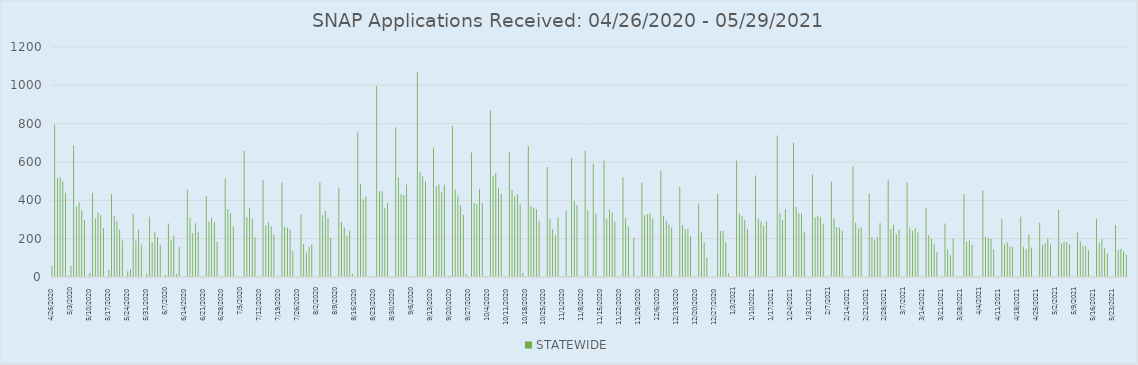
| Category | STATEWIDE |
|---|---|
| 4/26/20 | 59 |
| 4/27/20 | 794 |
| 4/28/20 | 515 |
| 4/29/20 | 519 |
| 4/30/20 | 500 |
| 5/1/20 | 440 |
| 5/2/20 | 8 |
| 5/3/20 | 57 |
| 5/4/20 | 686 |
| 5/5/20 | 366 |
| 5/6/20 | 389 |
| 5/7/20 | 348 |
| 5/8/20 | 298 |
| 5/10/20 | 21 |
| 5/11/20 | 440 |
| 5/12/20 | 306 |
| 5/13/20 | 338 |
| 5/14/20 | 323 |
| 5/15/20 | 256 |
| 5/17/20 | 36 |
| 5/18/20 | 432 |
| 5/19/20 | 320 |
| 5/20/20 | 291 |
| 5/21/20 | 247 |
| 5/22/20 | 191 |
| 5/24/20 | 30 |
| 5/25/20 | 42 |
| 5/26/20 | 331 |
| 5/27/20 | 191 |
| 5/28/20 | 248 |
| 5/29/20 | 169 |
| 5/31/20 | 17 |
| 6/1/20 | 314 |
| 6/2/20 | 182 |
| 6/3/20 | 236 |
| 6/4/20 | 209 |
| 6/5/20 | 168 |
| 6/7/20 | 12 |
| 6/8/20 | 279 |
| 6/9/20 | 193 |
| 6/10/20 | 215 |
| 6/11/20 | 16 |
| 6/12/20 | 157 |
| 6/14/20 | 4 |
| 6/15/20 | 455 |
| 6/16/20 | 309 |
| 6/17/20 | 228 |
| 6/18/20 | 280 |
| 6/19/20 | 236 |
| 6/21/20 | 2 |
| 6/22/20 | 423 |
| 6/23/20 | 288 |
| 6/24/20 | 311 |
| 6/25/20 | 287 |
| 6/26/20 | 182 |
| 6/28/20 | 1 |
| 6/29/20 | 512 |
| 6/30/20 | 354 |
| 7/1/20 | 332 |
| 7/2/20 | 263 |
| 7/6/20 | 657 |
| 7/7/20 | 313 |
| 7/8/20 | 359 |
| 7/9/20 | 302 |
| 7/10/20 | 207 |
| 7/12/20 | 1 |
| 7/13/20 | 508 |
| 7/14/20 | 270 |
| 7/15/20 | 286 |
| 7/16/20 | 264 |
| 7/17/20 | 225 |
| 7/20/20 | 495 |
| 7/21/20 | 262 |
| 7/22/20 | 257 |
| 7/23/20 | 247 |
| 7/24/20 | 136 |
| 7/27/20 | 327 |
| 7/28/20 | 172 |
| 7/29/20 | 128 |
| 7/30/20 | 158 |
| 7/31/20 | 171 |
| 8/2/20 | 1 |
| 8/3/20 | 495 |
| 8/4/20 | 322 |
| 8/5/20 | 346 |
| 8/6/20 | 309 |
| 8/7/20 | 203 |
| 8/9/20 | 1 |
| 8/10/20 | 466 |
| 8/11/20 | 287 |
| 8/12/20 | 258 |
| 8/13/20 | 216 |
| 8/14/20 | 241 |
| 8/15/20 | 17 |
| 8/16/20 | 2 |
| 8/17/20 | 759 |
| 8/18/20 | 484 |
| 8/19/20 | 405 |
| 8/20/20 | 421 |
| 8/21/20 | 3 |
| 8/22/20 | 1 |
| 8/23/20 | 1 |
| 8/24/20 | 996 |
| 8/25/20 | 448 |
| 8/26/20 | 448 |
| 8/27/20 | 361 |
| 8/28/20 | 386 |
| 8/29/20 | 2 |
| 8/30/20 | 4 |
| 8/31/20 | 781 |
| 9/1/20 | 519 |
| 9/2/20 | 433 |
| 9/3/20 | 428 |
| 9/4/20 | 483 |
| 9/5/20 | 3 |
| 9/6/20 | 1 |
| 9/7/20 | 4 |
| 9/8/20 | 1069 |
| 9/9/20 | 549 |
| 9/10/20 | 525 |
| 9/11/20 | 500 |
| 9/12/20 | 1 |
| 9/14/20 | 676 |
| 9/15/20 | 473 |
| 9/16/20 | 482 |
| 9/17/20 | 442 |
| 9/18/20 | 481 |
| 9/19/20 | 2 |
| 9/20/20 | 8 |
| 9/21/20 | 787 |
| 9/22/20 | 457 |
| 9/23/20 | 425 |
| 9/24/20 | 373 |
| 9/25/20 | 324 |
| 9/26/20 | 16 |
| 9/27/20 | 2 |
| 9/28/20 | 650 |
| 9/29/20 | 386 |
| 9/30/20 | 379 |
| 10/1/20 | 460 |
| 10/2/20 | 385 |
| 10/3/20 | 2 |
| 10/4/20 | 1 |
| 10/5/20 | 870 |
| 10/6/20 | 527 |
| 10/7/20 | 543 |
| 10/8/20 | 463 |
| 10/9/20 | 435 |
| 10/10/20 | 1 |
| 10/12/20 | 651 |
| 10/13/20 | 455 |
| 10/14/20 | 423 |
| 10/15/20 | 431 |
| 10/16/20 | 380 |
| 10/17/20 | 22 |
| 10/18/20 | 2 |
| 10/19/20 | 683 |
| 10/20/20 | 371 |
| 10/21/20 | 361 |
| 10/22/20 | 353 |
| 10/23/20 | 293 |
| 10/25/20 | 1 |
| 10/26/20 | 574 |
| 10/27/20 | 302 |
| 10/28/20 | 249 |
| 10/29/20 | 218 |
| 10/30/20 | 310 |
| 10/31/20 | 1 |
| 11/1/20 | 5 |
| 11/2/20 | 344 |
| 11/3/20 | 5 |
| 11/4/20 | 621 |
| 11/5/20 | 398 |
| 11/6/20 | 375 |
| 11/8/20 | 1 |
| 11/9/20 | 658 |
| 11/10/20 | 348 |
| 11/11/20 | 3 |
| 11/12/20 | 591 |
| 11/13/20 | 330 |
| 11/14/20 | 1 |
| 11/16/20 | 608 |
| 11/17/20 | 303 |
| 11/18/20 | 352 |
| 11/19/20 | 336 |
| 11/20/20 | 289 |
| 11/21/20 | 1 |
| 11/23/20 | 520 |
| 11/24/20 | 309 |
| 11/25/20 | 261 |
| 11/26/20 | 1 |
| 11/27/20 | 204 |
| 11/29/20 | 2 |
| 11/30/20 | 492 |
| 12/1/20 | 322 |
| 12/2/20 | 327 |
| 12/3/20 | 332 |
| 12/4/20 | 305 |
| 12/5/20 | 1 |
| 12/7/20 | 554 |
| 12/8/20 | 318 |
| 12/9/20 | 293 |
| 12/10/20 | 274 |
| 12/11/20 | 257 |
| 12/13/20 | 1 |
| 12/14/20 | 469 |
| 12/15/20 | 270 |
| 12/16/20 | 250 |
| 12/17/20 | 250 |
| 12/18/20 | 214 |
| 12/20/20 | 3 |
| 12/21/20 | 383 |
| 12/22/20 | 233 |
| 12/23/20 | 182 |
| 12/24/20 | 103 |
| 12/26/20 | 2 |
| 12/28/20 | 432 |
| 12/29/20 | 240 |
| 12/30/20 | 241 |
| 12/31/20 | 181 |
| 1/1/21 | 19 |
| 1/2/21 | 1 |
| 1/4/21 | 608 |
| 1/5/21 | 330 |
| 1/6/21 | 317 |
| 1/7/21 | 299 |
| 1/8/21 | 252 |
| 1/11/21 | 530 |
| 1/12/21 | 306 |
| 1/13/21 | 290 |
| 1/14/21 | 268 |
| 1/15/21 | 288 |
| 1/17/21 | 3 |
| 1/19/21 | 738 |
| 1/20/21 | 335 |
| 1/21/21 | 296 |
| 1/22/21 | 353 |
| 1/24/21 | 1 |
| 1/25/21 | 700 |
| 1/26/21 | 365 |
| 1/27/21 | 334 |
| 1/28/21 | 332 |
| 1/29/21 | 236 |
| 2/1/21 | 535 |
| 2/2/21 | 309 |
| 2/3/21 | 321 |
| 2/4/21 | 312 |
| 2/5/21 | 278 |
| 2/8/21 | 498 |
| 2/9/21 | 306 |
| 2/10/21 | 261 |
| 2/11/21 | 257 |
| 2/12/21 | 240 |
| 2/13/21 | 1 |
| 2/15/21 | 1 |
| 2/16/21 | 576 |
| 2/17/21 | 284 |
| 2/18/21 | 254 |
| 2/19/21 | 260 |
| 2/22/21 | 436 |
| 2/23/21 | 209 |
| 2/24/21 | 194 |
| 2/25/21 | 210 |
| 2/26/21 | 282 |
| 2/28/21 | 1 |
| 3/1/21 | 508 |
| 3/2/21 | 249 |
| 3/3/21 | 272 |
| 3/4/21 | 225 |
| 3/5/21 | 248 |
| 3/7/21 | 1 |
| 3/8/21 | 494 |
| 3/9/21 | 258 |
| 3/10/21 | 241 |
| 3/11/21 | 255 |
| 3/12/21 | 233 |
| 3/15/21 | 360 |
| 3/16/21 | 218 |
| 3/17/21 | 201 |
| 3/18/21 | 175 |
| 3/19/21 | 132 |
| 3/21/21 | 1 |
| 3/22/21 | 279 |
| 3/23/21 | 142 |
| 3/24/21 | 114 |
| 3/25/21 | 201 |
| 3/29/21 | 435 |
| 3/30/21 | 185 |
| 3/31/21 | 190 |
| 4/1/21 | 168 |
| 4/2/21 | 2 |
| 4/5/21 | 451 |
| 4/6/21 | 210 |
| 4/7/21 | 202 |
| 4/8/21 | 199 |
| 4/9/21 | 145 |
| 4/12/21 | 301 |
| 4/13/21 | 170 |
| 4/14/21 | 180 |
| 4/15/21 | 161 |
| 4/16/21 | 156 |
| 4/17/21 | 1 |
| 4/18/21 | 1 |
| 4/19/21 | 314 |
| 4/20/21 | 155 |
| 4/21/21 | 146 |
| 4/22/21 | 222 |
| 4/23/21 | 154 |
| 4/26/21 | 283 |
| 4/27/21 | 168 |
| 4/28/21 | 177 |
| 4/29/21 | 202 |
| 4/30/21 | 170 |
| 5/1/21 | 3 |
| 5/3/21 | 351 |
| 5/4/21 | 174 |
| 5/5/21 | 184 |
| 5/6/21 | 183 |
| 5/7/21 | 171 |
| 5/10/21 | 234 |
| 5/11/21 | 187 |
| 5/12/21 | 163 |
| 5/13/21 | 162 |
| 5/14/21 | 140 |
| 5/17/21 | 302 |
| 5/18/21 | 176 |
| 5/19/21 | 198 |
| 5/20/21 | 150 |
| 5/21/21 | 122 |
| 5/24/21 | 271 |
| 5/25/21 | 142 |
| 5/26/21 | 148 |
| 5/27/21 | 135 |
| 5/28/21 | 116 |